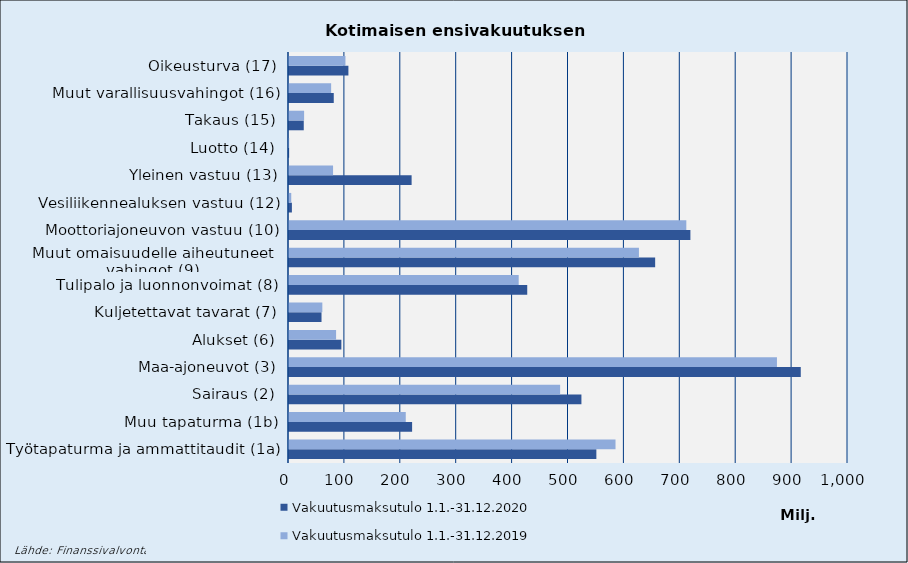
| Category | Vakuutusmaksutulo |
|---|---|
| Työtapaturma ja ammattitaudit (1a) | 584107.618 |
| Muu tapaturma (1b) | 208878.114 |
| Sairaus (2) | 485031.084 |
| Maa-ajoneuvot (3) | 872909.039 |
| Alukset (6) | 84239.323 |
| Kuljetettavat tavarat (7) | 59637.354 |
| Tulipalo ja luonnonvoimat (8) | 410901.802 |
| Muut omaisuudelle aiheutuneet 
vahingot (9) | 625996.929 |
| Moottoriajoneuvon vastuu (10) | 710774.018 |
| Vesiliikennealuksen vastuu (12) | 4030.047 |
| Yleinen vastuu (13) | 78821.021 |
| Luotto (14) | 276.984 |
| Takaus (15) | 27025.959 |
| Muut varallisuusvahingot (16) | 75381.89 |
| Oikeusturva (17) | 100971.288 |